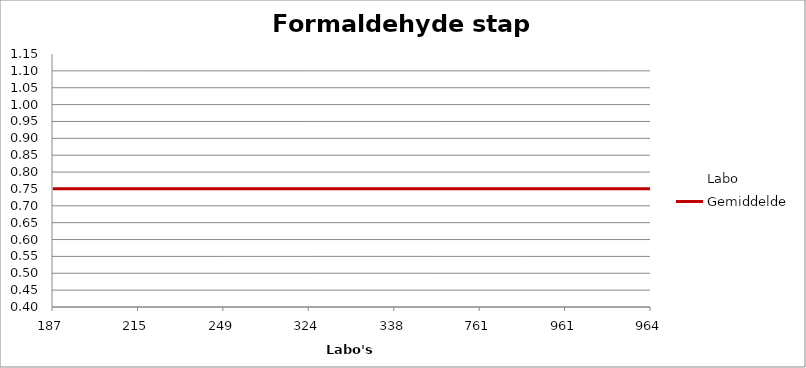
| Category | Labo | Gemiddelde |
|---|---|---|
| 187.0 | 0.788 | 0.75 |
| 215.0 | 0.879 | 0.75 |
| 249.0 | 0.904 | 0.75 |
| 324.0 | 0.702 | 0.75 |
| 338.0 | 0.505 | 0.75 |
| 761.0 | 0.741 | 0.75 |
| 961.0 | 0.419 | 0.75 |
| 964.0 | 1.066 | 0.75 |